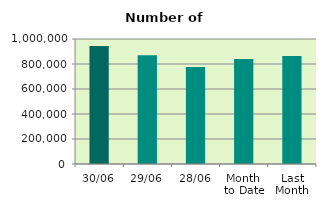
| Category | Series 0 |
|---|---|
| 30/06 | 944652 |
| 29/06 | 870722 |
| 28/06 | 775986 |
| Month 
to Date | 840506.364 |
| Last
Month | 864947.091 |